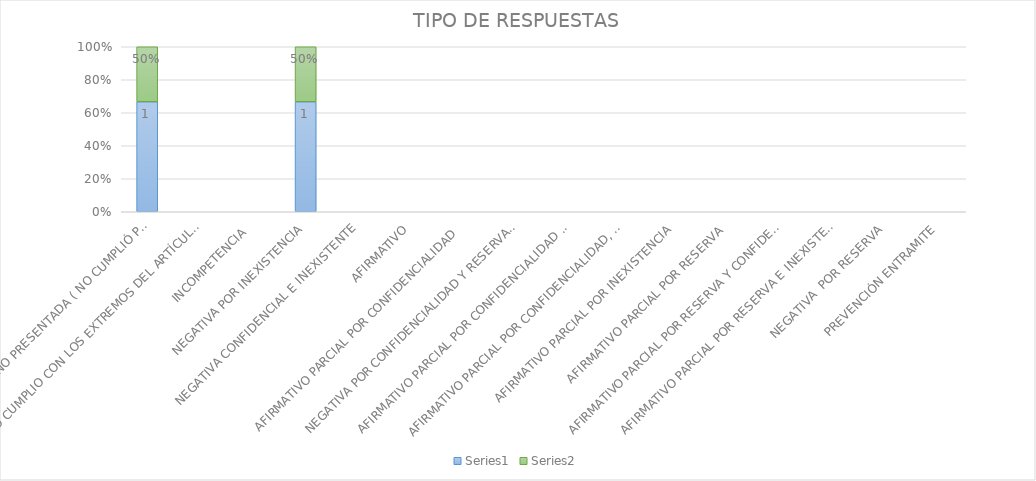
| Category | Series 4 | Series 5 |
|---|---|---|
| SE TIENE POR NO PRESENTADA ( NO CUMPLIÓ PREVENCIÓN) | 1 | 0.5 |
| NO CUMPLIO CON LOS EXTREMOS DEL ARTÍCULO 79 (REQUISITOS) | 0 | 0 |
| INCOMPETENCIA  | 0 | 0 |
| NEGATIVA POR INEXISTENCIA | 1 | 0.5 |
| NEGATIVA CONFIDENCIAL E INEXISTENTE | 0 | 0 |
| AFIRMATIVO | 0 | 0 |
| AFIRMATIVO PARCIAL POR CONFIDENCIALIDAD  | 0 | 0 |
| NEGATIVA POR CONFIDENCIALIDAD Y RESERVADA | 0 | 0 |
| AFIRMATIVO PARCIAL POR CONFIDENCIALIDAD E INEXISTENCIA | 0 | 0 |
| AFIRMATIVO PARCIAL POR CONFIDENCIALIDAD, RESERVA E INEXISTENCIA | 0 | 0 |
| AFIRMATIVO PARCIAL POR INEXISTENCIA | 0 | 0 |
| AFIRMATIVO PARCIAL POR RESERVA | 0 | 0 |
| AFIRMATIVO PARCIAL POR RESERVA Y CONFIDENCIALIDAD | 0 | 0 |
| AFIRMATIVO PARCIAL POR RESERVA E INEXISTENCIA | 0 | 0 |
| NEGATIVA  POR RESERVA | 0 | 0 |
| PREVENCIÓN ENTRAMITE | 0 | 0 |